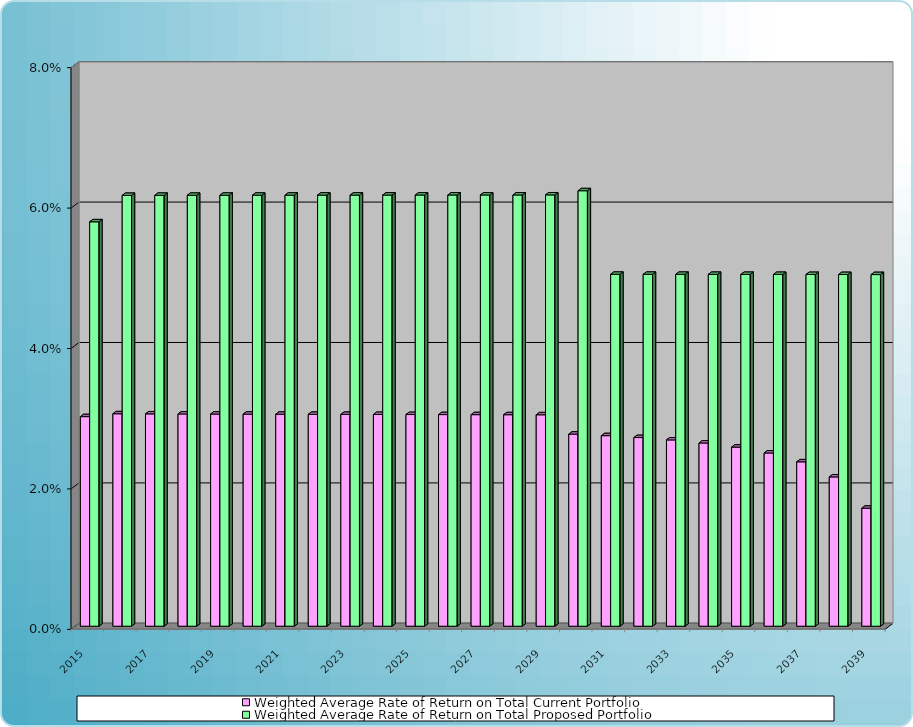
| Category | Weighted Average Rate of Return on Total Current Portfolio | Weighted Average Rate of Return on Total Proposed Portfolio |
|---|---|---|
| 2015.0 | 0.03 | 0.058 |
| 2016.0 | 0.03 | 0.061 |
| 2017.0 | 0.03 | 0.061 |
| 2018.0 | 0.03 | 0.061 |
| 2019.0 | 0.03 | 0.061 |
| 2020.0 | 0.03 | 0.061 |
| 2021.0 | 0.03 | 0.061 |
| 2022.0 | 0.03 | 0.061 |
| 2023.0 | 0.03 | 0.061 |
| 2024.0 | 0.03 | 0.061 |
| 2025.0 | 0.03 | 0.061 |
| 2026.0 | 0.03 | 0.061 |
| 2027.0 | 0.03 | 0.061 |
| 2028.0 | 0.03 | 0.061 |
| 2029.0 | 0.03 | 0.061 |
| 2030.0 | 0.027 | 0.062 |
| 2031.0 | 0.027 | 0.05 |
| 2032.0 | 0.027 | 0.05 |
| 2033.0 | 0.027 | 0.05 |
| 2034.0 | 0.026 | 0.05 |
| 2035.0 | 0.026 | 0.05 |
| 2036.0 | 0.025 | 0.05 |
| 2037.0 | 0.023 | 0.05 |
| 2038.0 | 0.021 | 0.05 |
| 2039.0 | 0.017 | 0.05 |